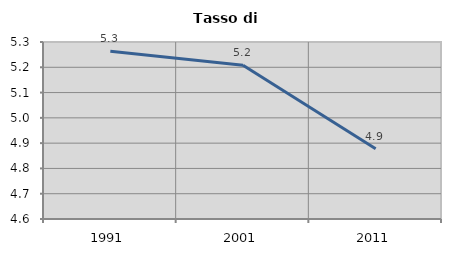
| Category | Tasso di disoccupazione   |
|---|---|
| 1991.0 | 5.263 |
| 2001.0 | 5.208 |
| 2011.0 | 4.878 |